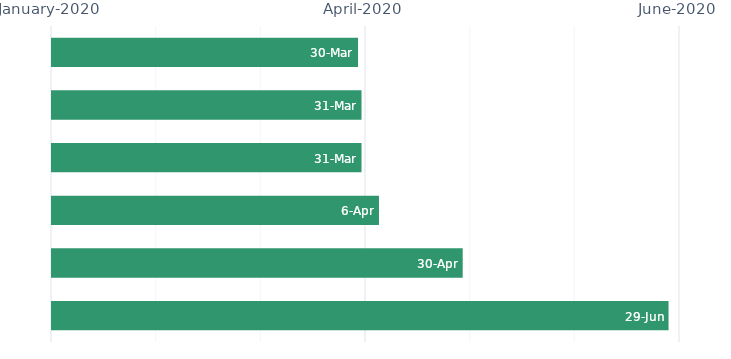
| Category | 2020 Start Date | Series 1 |
|---|---|---|
| Premium Increase Program (PIP) Simplification | 2020-01-02 | 88 |
| Principles Based Reserves | 2020-01-02 | 89 |
| Agent Portal -  March 2020 Release | 2020-01-02 | 89 |
| TotalSecure Inforce Illustrations | 2020-01-02 | 94 |
| Agent Portal -  April 2020 Release | 2020-01-02 | 118 |
| 2020 SPDA Enhancements | 2020-01-02 | 177 |